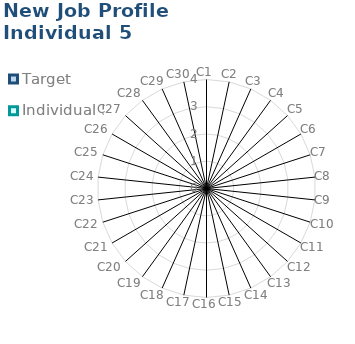
| Category | Target | Individual 5 |
|---|---|---|
| C1 | 0 | 0 |
| C2 | 0 | 0 |
| C3 | 0 | 0 |
| C4 | 0 | 0 |
| C5 | 0 | 0 |
| C6 | 0 | 0 |
| C7 | 0 | 0 |
| C8 | 0 | 0 |
| C9 | 0 | 0 |
| C10 | 0 | 0 |
| C11 | 0 | 0 |
| C12 | 0 | 0 |
| C13 | 0 | 0 |
| C14 | 0 | 0 |
| C15 | 0 | 0 |
| C16 | 0 | 0 |
| C17 | 0 | 0 |
| C18 | 0 | 0 |
| C19 | 0 | 0 |
| C20 | 0 | 0 |
| C21 | 0 | 0 |
| C22 | 0 | 0 |
| C23 | 0 | 0 |
| C24 | 0 | 0 |
| C25 | 0 | 0 |
| C26 | 0 | 0 |
| C27 | 0 | 0 |
| C28 | 0 | 0 |
| C29 | 0 | 0 |
| C30 | 0 | 0 |